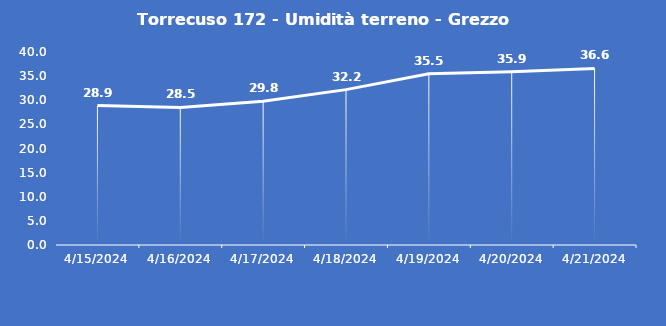
| Category | Torrecuso 172 - Umidità terreno - Grezzo (%VWC) |
|---|---|
| 4/15/24 | 28.9 |
| 4/16/24 | 28.5 |
| 4/17/24 | 29.8 |
| 4/18/24 | 32.2 |
| 4/19/24 | 35.5 |
| 4/20/24 | 35.9 |
| 4/21/24 | 36.6 |